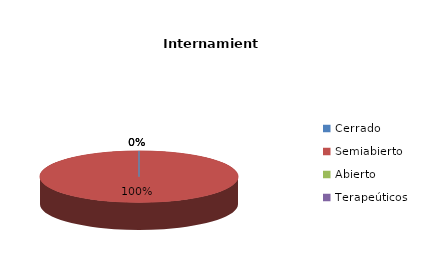
| Category | Series 0 |
|---|---|
| Cerrado | 0 |
| Semiabierto | 4 |
| Abierto | 0 |
| Terapeúticos | 0 |